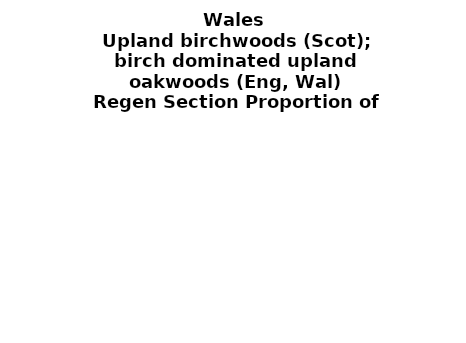
| Category | Upland birchwoods (Scot); birch dominated upland oakwoods (Eng, Wal) |
|---|---|
| None | 0.001 |
| Seedlings only | 0 |
| Seedlings, saplings only | 0.03 |
| Seedlings, saplings, <7 cm trees | 0.041 |
| Saplings only | 0.305 |
| <7 cm trees, seedlings only | 0 |
| <7 cm trees, saplings only | 0.411 |
| <7 cm Trees only | 0.212 |